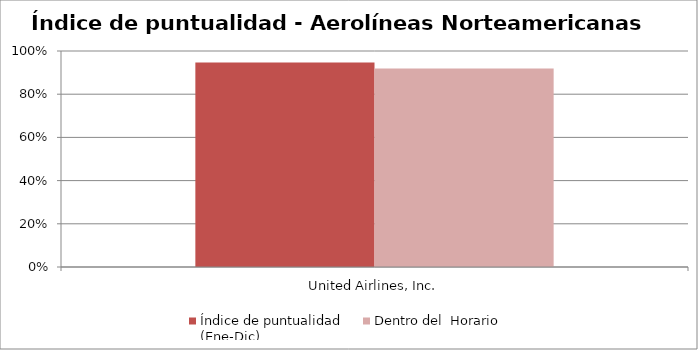
| Category | Índice de puntualidad
(Ene-Dic) | Dentro del  Horario |
|---|---|---|
| United Airlines, Inc. | 0.947 | 0.919 |